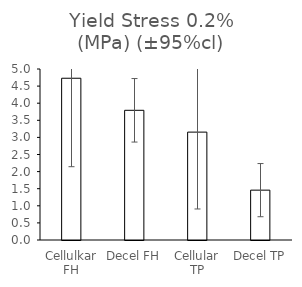
| Category | Series 0 |
|---|---|
| Cellulkar FH | 4.73 |
| Decel FH | 3.792 |
| Cellular TP | 3.155 |
| Decel TP | 1.458 |